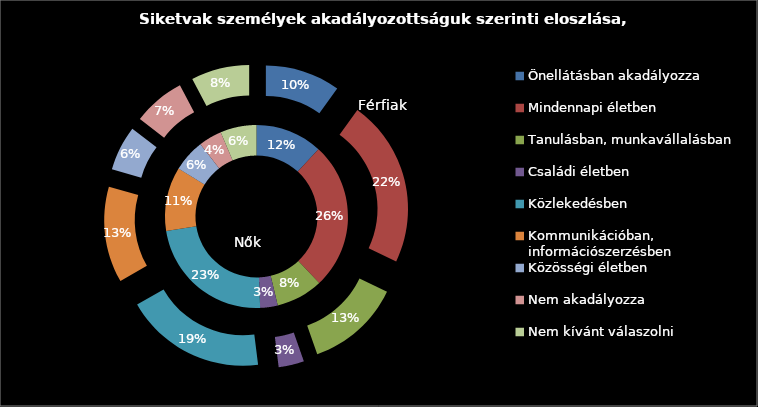
| Category | Nők | Férfiak |
|---|---|---|
| 0 | 444 | 300 |
| 1 | 981 | 668 |
| 2 | 311 | 379 |
| 3 | 116 | 102 |
| 4 | 867 | 564 |
| 5 | 424 | 384 |
| 6 | 215 | 180 |
| 7 | 154 | 208 |
| 8 | 240 | 233 |